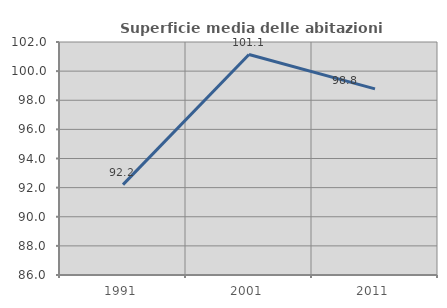
| Category | Superficie media delle abitazioni occupate |
|---|---|
| 1991.0 | 92.208 |
| 2001.0 | 101.14 |
| 2011.0 | 98.778 |